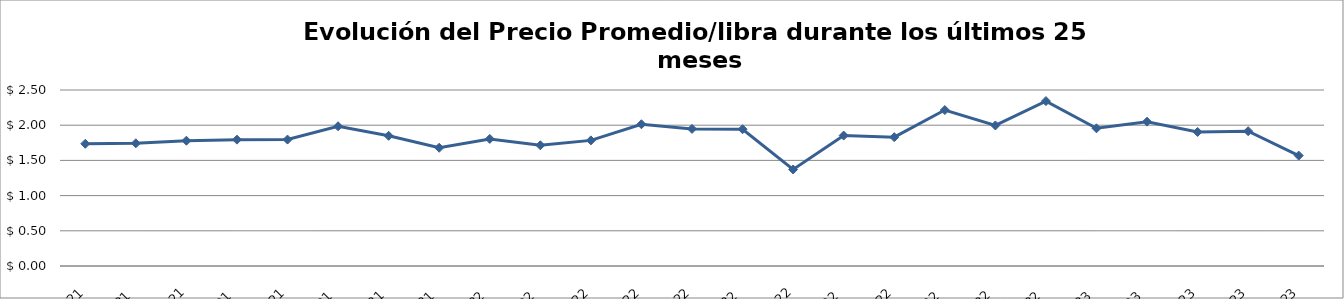
| Category | Series 0 |
|---|---|
| 2021-05-01 | 1.736 |
| 2021-06-01 | 1.743 |
| 2021-07-01 | 1.78 |
| 2021-08-01 | 1.795 |
| 2021-09-01 | 1.796 |
| 2021-10-01 | 1.985 |
| 2021-11-01 | 1.849 |
| 2021-12-01 | 1.68 |
| 2022-01-01 | 1.805 |
| 2022-02-01 | 1.715 |
| 2022-03-01 | 1.784 |
| 2022-04-01 | 2.013 |
| 2022-05-01 | 1.948 |
| 2022-06-01 | 1.943 |
| 2022-07-01 | 1.371 |
| 2022-08-01 | 1.853 |
| 2022-09-01 | 1.83 |
| 2022-10-01 | 2.215 |
| 2022-11-01 | 1.996 |
| 2022-12-01 | 2.343 |
| 2023-01-01 | 1.956 |
| 2023-02-01 | 2.05 |
| 2023-03-01 | 1.904 |
| 2023-04-01 | 1.915 |
| 2023-05-01 | 1.568 |